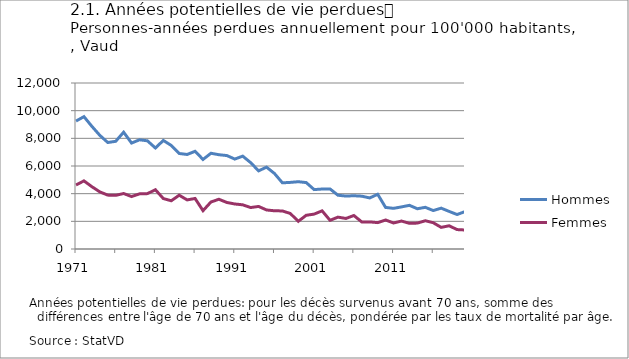
| Category | Hommes | Femmes |
|---|---|---|
| 1971.0 | 9248.178 | 4626.958 |
| 1972.0 | 9567.918 | 4924.256 |
| 1973.0 | 8866.667 | 4504.149 |
| 1974.0 | 8217.553 | 4129.895 |
| 1975.0 | 7698.882 | 3895.374 |
| 1976.0 | 7783.991 | 3878.97 |
| 1977.0 | 8443.722 | 4010.883 |
| 1978.0 | 7658.532 | 3790.69 |
| 1979.0 | 7894.642 | 3987.878 |
| 1980.0 | 7820.253 | 4003.052 |
| 1981.0 | 7300.597 | 4284.94 |
| 1982.0 | 7848.027 | 3647.908 |
| 1983.0 | 7484.725 | 3485.932 |
| 1984.0 | 6903.863 | 3888.78 |
| 1985.0 | 6833.747 | 3548.04 |
| 1986.0 | 7063.3 | 3653.024 |
| 1987.0 | 6473.017 | 2770.393 |
| 1988.0 | 6920.85 | 3399.56 |
| 1989.0 | 6815.388 | 3595.512 |
| 1990.0 | 6755.571 | 3364.116 |
| 1991.0 | 6500.376 | 3254.288 |
| 1992.0 | 6712.819 | 3194.461 |
| 1993.0 | 6243.533 | 2995.636 |
| 1994.0 | 5648.721 | 3076.831 |
| 1995.0 | 5917.719 | 2821.569 |
| 1996.0 | 5458.194 | 2762.362 |
| 1997.0 | 4783.457 | 2752.247 |
| 1998.0 | 4815.358 | 2565.791 |
| 1999.0 | 4864.342 | 2000.742 |
| 2000.0 | 4800.733 | 2437.068 |
| 2001.0 | 4293.913 | 2522.797 |
| 2002.0 | 4335.624 | 2758.178 |
| 2003.0 | 4341.653 | 2072.829 |
| 2004.0 | 3885.769 | 2304.181 |
| 2005.0 | 3826.474 | 2207.701 |
| 2006.0 | 3850.48 | 2422.056 |
| 2007.0 | 3817.411 | 1954.205 |
| 2008.0 | 3691.374 | 1959.917 |
| 2009.0 | 3955.961 | 1907.295 |
| 2010.0 | 3004.832 | 2097.198 |
| 2011.0 | 2939.42 | 1881.933 |
| 2012.0 | 3042.833 | 2020.451 |
| 2013.0 | 3156.016 | 1857.385 |
| 2014.0 | 2909.287 | 1872.728 |
| 2015.0 | 3013.057 | 2042.126 |
| 2016.0 | 2779.143 | 1899.372 |
| 2017.0 | 2952.218 | 1563.283 |
| 2018.0 | 2717.274 | 1678.338 |
| 2019.0 | 2492.688 | 1404.048 |
| 2020.0 | 2704.195 | 1373.543 |